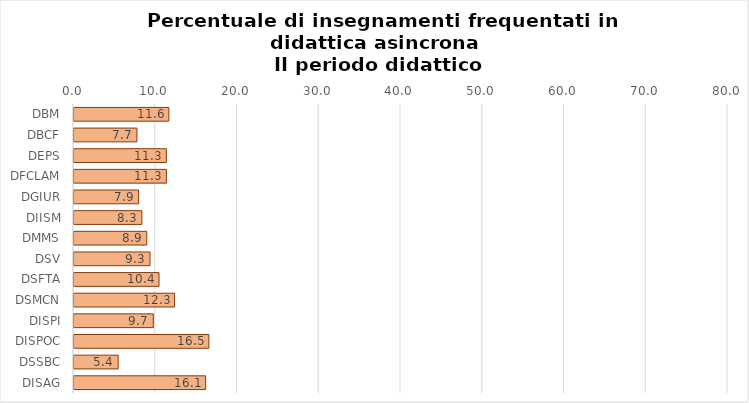
| Category | Series 0 |
|---|---|
| DBM | 11.6 |
| DBCF | 7.7 |
| DEPS | 11.3 |
| DFCLAM | 11.3 |
| DGIUR | 7.9 |
| DIISM | 8.3 |
| DMMS | 8.9 |
| DSV | 9.3 |
| DSFTA | 10.4 |
| DSMCN | 12.3 |
| DISPI | 9.7 |
| DISPOC | 16.5 |
| DSSBC | 5.4 |
| DISAG | 16.1 |